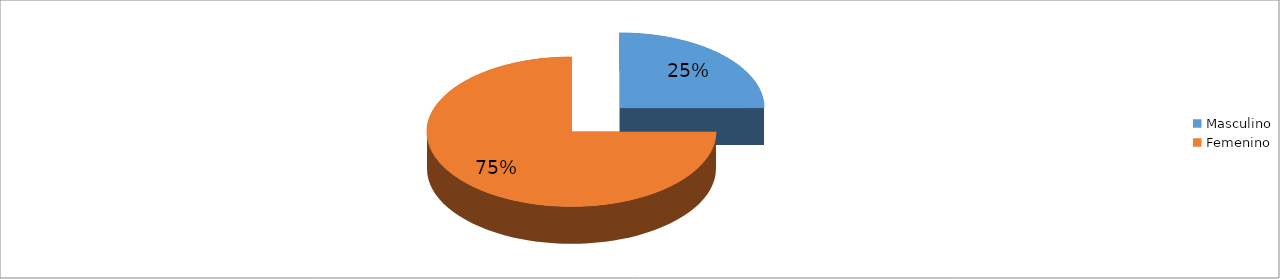
| Category | Series 0 |
|---|---|
| Masculino | 0.25 |
| Femenino | 0.75 |